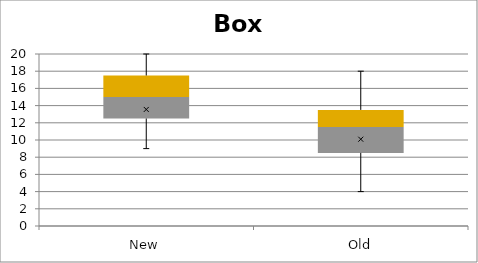
| Category | Min | Q1-Min | Med-Q1 | Q3-Med |
|---|---|---|---|---|
| New | 9 | 3.5 | 2.5 | 2.5 |
| Old | 4 | 4.5 | 3 | 2 |